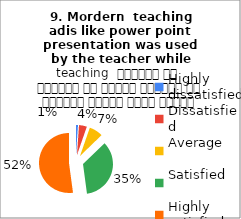
| Category |  9. Mordern  teaching 
adis like power point presentation was used by the teacher while teaching  शिक्षक ने शिक्षण के दौरान शिक्षण की आधुनिक तकनीक पावर पॉइंट का प्रयोग किया |
|---|---|
| Highly dissatisfied | 1 |
| Dissatisfied | 4 |
| Average | 7 |
| Satisfied | 33 |
| Highly satisfied | 49 |